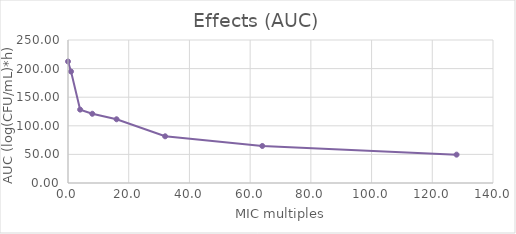
| Category | AUC0-24 |
|---|---|
| 0.0 | 212.454 |
| 1.0 | 194.902 |
| 4.0 | 128.301 |
| 8.0 | 121.039 |
| 16.0 | 111.416 |
| 32.0 | 81.658 |
| 64.0 | 64.747 |
| 128.0 | 49.569 |